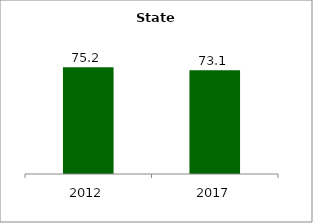
| Category | State |
|---|---|
| 2012.0 | 75.19 |
| 2017.0 | 73.063 |